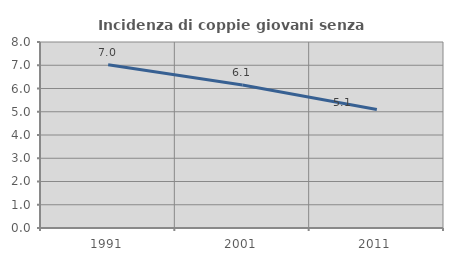
| Category | Incidenza di coppie giovani senza figli |
|---|---|
| 1991.0 | 7.018 |
| 2001.0 | 6.148 |
| 2011.0 | 5.099 |